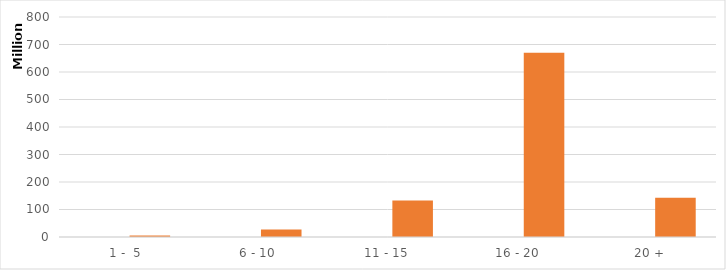
| Category | Series 0 | Series 1 |
|---|---|---|
|  1 -  5 | 10 | 5521358.25 |
|  6 - 10 | 40 | 26898727.04 |
| 11 - 15 | 187 | 132402592.34 |
| 16 - 20 | 773 | 670435322.59 |
| 20 + | 129 | 142722382.35 |